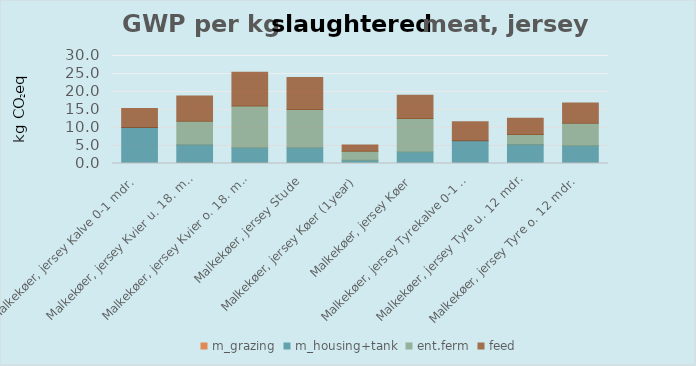
| Category | m_grazing | m_housing+tank | ent.ferm | feed |
|---|---|---|---|---|
| Malkekøer, jersey Kalve 0-1 mdr. | 0 | 10.002 | 0 | 5.248 |
| Malkekøer, jersey Kvier u. 18. mdr. | 0.163 | 5.024 | 6.547 | 7.038 |
| Malkekøer, jersey Kvier o. 18. mdr. | 0.165 | 4.216 | 11.62 | 9.347 |
| Malkekøer, jersey Stude | 0.16 | 4.204 | 10.642 | 8.885 |
| Malkekøer, jersey Køer (1year) | 0.019 | 0.85 | 2.554 | 1.723 |
| Malkekøer, jersey Køer | 0.079 | 3.136 | 9.297 | 6.459 |
| Malkekøer, jersey Tyrekalve 0-1 mdr. | 0 | 6.318 | 0 | 5.248 |
| Malkekøer, jersey Tyre u. 12 mdr. | 0 | 5.301 | 2.737 | 4.498 |
| Malkekøer, jersey Tyre o. 12 mdr. | 0 | 4.944 | 6.219 | 5.662 |